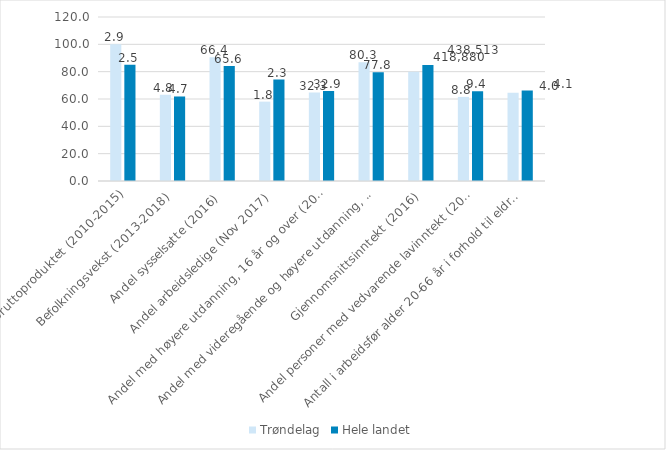
| Category | Trøndelag | Hele landet |
|---|---|---|
| Endring i bruttoproduktet (2010-2015) | 100 | 85.077 |
| Befolkningsvekst (2013-2018) | 63.158 | 61.842 |
| Andel sysselsatte (2016) | 90.476 | 84.127 |
| Andel arbeidsledige (Nov 2017) | 58.065 | 74.194 |
| Andel med høyere utdanning, 16 år og over (2016) | 64.729 | 65.932 |
| Andel med videregående og høyere utdanning, 25-29 år (2016) | 86.819 | 79.656 |
| Gjennomsnittsinntekt (2016) | 79.88 | 84.798 |
| Andel personer med vedvarende lavinntekt (2014-16) | 61.538 | 65.734 |
| Antall i arbeidsfør alder 20-66 år i forhold til eldre 67 år og over (2018) | 64.516 | 66.129 |